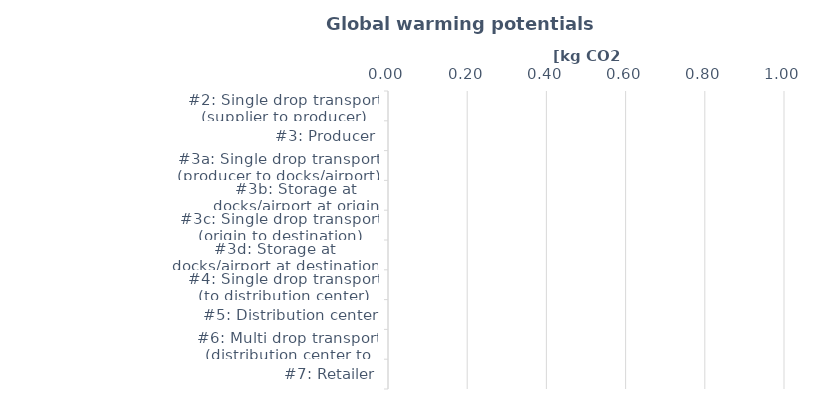
| Category | GWP |
|---|---|
| #2: Single drop transport (supplier to producer) | 0 |
| #3: Producer | 0 |
| #3a: Single drop transport (producer to docks/airport) | 0 |
| #3b: Storage at docks/airport at origin | 0 |
| #3c: Single drop transport (origin to destination) | 0 |
| #3d: Storage at docks/airport at destination | 0 |
| #4: Single drop transport (to distribution center) | 0 |
| #5: Distribution center | 0 |
| #6: Multi drop transport (distribution center to retailer) | 0 |
| #7: Retailer | 0 |